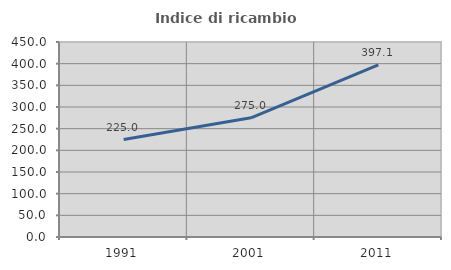
| Category | Indice di ricambio occupazionale  |
|---|---|
| 1991.0 | 225 |
| 2001.0 | 275 |
| 2011.0 | 397.059 |